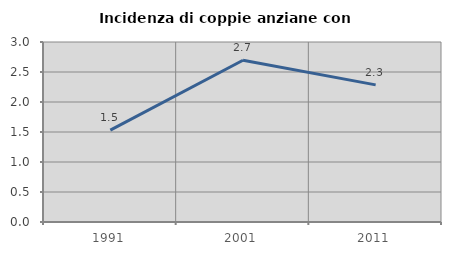
| Category | Incidenza di coppie anziane con figli |
|---|---|
| 1991.0 | 1.531 |
| 2001.0 | 2.696 |
| 2011.0 | 2.285 |